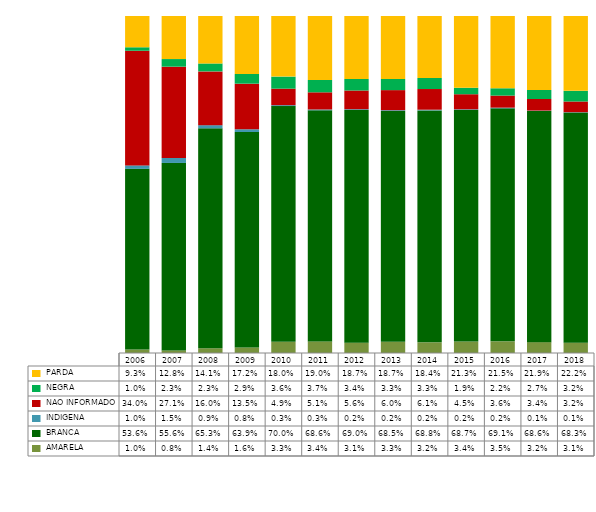
| Category |  AMARELA     |  BRANCA      |  INDIGENA    |  NAO INFORMADO  |  NEGRA       |  PARDA       |
|---|---|---|---|---|---|---|
| 2006.0 | 0.01 | 0.536 | 0.01 | 0.34 | 0.01 | 0.093 |
| 2007.0 | 0.008 | 0.556 | 0.015 | 0.271 | 0.023 | 0.128 |
| 2008.0 | 0.014 | 0.653 | 0.009 | 0.16 | 0.023 | 0.141 |
| 2009.0 | 0.016 | 0.639 | 0.008 | 0.135 | 0.029 | 0.172 |
| 2010.0 | 0.033 | 0.7 | 0.003 | 0.049 | 0.036 | 0.18 |
| 2011.0 | 0.034 | 0.686 | 0.003 | 0.051 | 0.037 | 0.19 |
| 2012.0 | 0.031 | 0.69 | 0.002 | 0.056 | 0.034 | 0.187 |
| 2013.0 | 0.033 | 0.685 | 0.002 | 0.06 | 0.033 | 0.187 |
| 2014.0 | 0.032 | 0.688 | 0.002 | 0.061 | 0.033 | 0.184 |
| 2015.0 | 0.034 | 0.687 | 0.002 | 0.045 | 0.019 | 0.213 |
| 2016.0 | 0.035 | 0.691 | 0.002 | 0.036 | 0.022 | 0.215 |
| 2017.0 | 0.032 | 0.686 | 0.001 | 0.034 | 0.027 | 0.219 |
| 2018.0 | 0.031 | 0.683 | 0.001 | 0.032 | 0.032 | 0.222 |